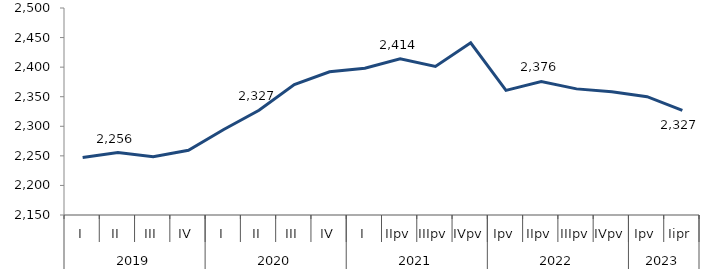
| Category | Series 0 |
|---|---|
| 0 | 2247.095 |
| 1 | 2255.594 |
| 2 | 2248.39 |
| 3 | 2259.472 |
| 4 | 2294.598 |
| 5 | 2327.144 |
| 6 | 2370.6 |
| 7 | 2392.098 |
| 8 | 2398.201 |
| 9 | 2413.932 |
| 10 | 2401.222 |
| 11 | 2441.157 |
| 12 | 2360.788 |
| 13 | 2375.82 |
| 14 | 2363.248 |
| 15 | 2358.48 |
| 16 | 2350 |
| 17 | 2327 |